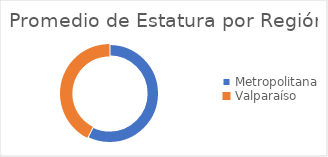
| Category | Total |
|---|---|
| Metropolitana | 75354 |
| Valparaíso | 55953 |